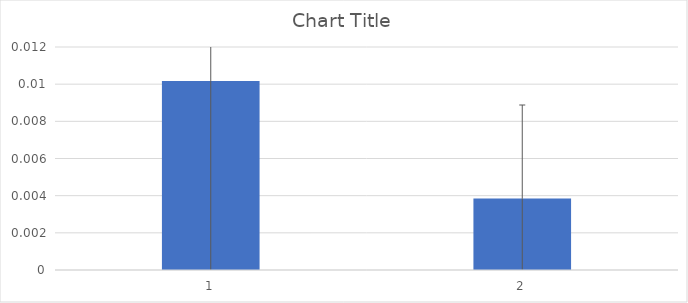
| Category | Series 0 |
|---|---|
| 0 | 0.01 |
| 1 | 0.004 |